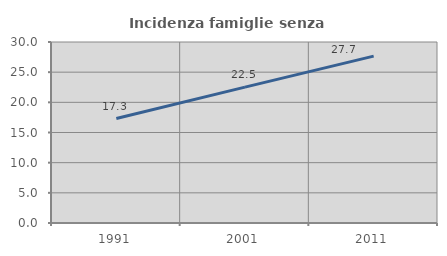
| Category | Incidenza famiglie senza nuclei |
|---|---|
| 1991.0 | 17.313 |
| 2001.0 | 22.52 |
| 2011.0 | 27.658 |